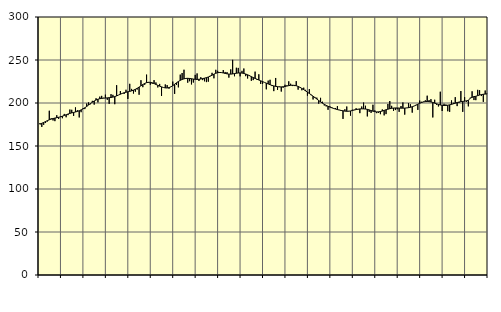
| Category | Piggar | Series 1 |
|---|---|---|
| nan | 176.6 | 175.3 |
| 1.0 | 172.2 | 176.43 |
| 1.0 | 174.6 | 177.39 |
| 1.0 | 176.7 | 178.47 |
| 1.0 | 178.5 | 179.49 |
| 1.0 | 191 | 180.46 |
| 1.0 | 182.2 | 181.28 |
| 1.0 | 179.7 | 181.91 |
| 1.0 | 178.9 | 182.47 |
| 1.0 | 185.8 | 182.92 |
| 1.0 | 181.4 | 183.39 |
| 1.0 | 184.4 | 183.97 |
| nan | 182.3 | 184.66 |
| 2.0 | 187.3 | 185.47 |
| 2.0 | 183.4 | 186.33 |
| 2.0 | 185.9 | 187.17 |
| 2.0 | 192.4 | 187.9 |
| 2.0 | 192.1 | 188.5 |
| 2.0 | 184.9 | 189.02 |
| 2.0 | 194.9 | 189.56 |
| 2.0 | 191.6 | 190.21 |
| 2.0 | 183.2 | 191.01 |
| 2.0 | 189.3 | 191.97 |
| 2.0 | 193.7 | 193.13 |
| nan | 192.9 | 194.47 |
| 3.0 | 199.4 | 195.99 |
| 3.0 | 200.7 | 197.65 |
| 3.0 | 198.5 | 199.34 |
| 3.0 | 202.5 | 200.93 |
| 3.0 | 198.1 | 202.33 |
| 3.0 | 205.5 | 203.49 |
| 3.0 | 200.7 | 204.38 |
| 3.0 | 207.4 | 204.97 |
| 3.0 | 208.3 | 205.35 |
| 3.0 | 206 | 205.61 |
| 3.0 | 209.7 | 205.77 |
| nan | 203.7 | 205.95 |
| 4.0 | 199 | 206.16 |
| 4.0 | 210.3 | 206.43 |
| 4.0 | 209.5 | 206.84 |
| 4.0 | 198.6 | 207.45 |
| 4.0 | 220.7 | 208.26 |
| 4.0 | 209.2 | 209.23 |
| 4.0 | 213.9 | 210.21 |
| 4.0 | 211.4 | 211.14 |
| 4.0 | 210.5 | 211.93 |
| 4.0 | 215.4 | 212.54 |
| 4.0 | 204.7 | 213.02 |
| nan | 222.3 | 213.51 |
| 5.0 | 216.4 | 214.12 |
| 5.0 | 211 | 214.92 |
| 5.0 | 213.1 | 215.91 |
| 5.0 | 215.7 | 217.13 |
| 5.0 | 209.6 | 218.53 |
| 5.0 | 226.5 | 220.03 |
| 5.0 | 218.4 | 221.5 |
| 5.0 | 221.1 | 222.75 |
| 5.0 | 233 | 223.64 |
| 5.0 | 223.5 | 224.08 |
| 5.0 | 221.3 | 224.03 |
| nan | 222.4 | 223.51 |
| 6.0 | 226.6 | 222.63 |
| 6.0 | 223.9 | 221.58 |
| 6.0 | 218.1 | 220.55 |
| 6.0 | 222.2 | 219.59 |
| 6.0 | 208.2 | 218.74 |
| 6.0 | 218.1 | 218.03 |
| 6.0 | 221.6 | 217.56 |
| 6.0 | 220.8 | 217.49 |
| 6.0 | 216.6 | 217.9 |
| 6.0 | 219 | 218.79 |
| 6.0 | 224.9 | 220.16 |
| nan | 210.6 | 221.8 |
| 7.0 | 221.1 | 223.47 |
| 7.0 | 218.2 | 225.01 |
| 7.0 | 233 | 226.32 |
| 7.0 | 234.9 | 227.37 |
| 7.0 | 238.7 | 228.12 |
| 7.0 | 228.4 | 228.57 |
| 7.0 | 223.6 | 228.69 |
| 7.0 | 225.3 | 228.54 |
| 7.0 | 221.6 | 228.21 |
| 7.0 | 223.8 | 227.85 |
| 7.0 | 232.7 | 227.56 |
| nan | 234.4 | 227.43 |
| 8.0 | 225.6 | 227.56 |
| 8.0 | 230 | 227.9 |
| 8.0 | 226.6 | 228.38 |
| 8.0 | 225.2 | 228.91 |
| 8.0 | 224.3 | 229.51 |
| 8.0 | 224.8 | 230.25 |
| 8.0 | 231.6 | 231.2 |
| 8.0 | 235.1 | 232.33 |
| 8.0 | 228.7 | 233.52 |
| 8.0 | 238.6 | 234.56 |
| 8.0 | 237.4 | 235.25 |
| nan | 235 | 235.5 |
| 9.0 | 235.6 | 235.36 |
| 9.0 | 238.3 | 234.94 |
| 9.0 | 236.1 | 234.39 |
| 9.0 | 235.9 | 233.91 |
| 9.0 | 229.5 | 233.61 |
| 9.0 | 239.1 | 233.58 |
| 9.0 | 250.2 | 233.82 |
| 9.0 | 231.1 | 234.2 |
| 9.0 | 241 | 234.61 |
| 9.0 | 240.8 | 234.9 |
| 9.0 | 231 | 234.97 |
| nan | 237.4 | 234.8 |
| 10.0 | 240.1 | 234.37 |
| 10.0 | 231.2 | 233.7 |
| 10.0 | 228.5 | 232.82 |
| 10.0 | 232.4 | 231.77 |
| 10.0 | 225.8 | 230.66 |
| 10.0 | 226.6 | 229.61 |
| 10.0 | 236.5 | 228.62 |
| 10.0 | 227 | 227.67 |
| 10.0 | 233.4 | 226.73 |
| 10.0 | 222.2 | 225.79 |
| 10.0 | 222.1 | 224.88 |
| nan | 224 | 223.97 |
| 11.0 | 215.9 | 223.05 |
| 11.0 | 226 | 222.13 |
| 11.0 | 227 | 221.26 |
| 11.0 | 219.7 | 220.49 |
| 11.0 | 213.8 | 219.85 |
| 11.0 | 229.1 | 219.34 |
| 11.0 | 215.2 | 218.96 |
| 11.0 | 219.2 | 218.74 |
| 11.0 | 213.3 | 218.72 |
| 11.0 | 217.8 | 218.89 |
| 11.0 | 221.2 | 219.24 |
| nan | 220.5 | 219.72 |
| 12.0 | 225.2 | 220.19 |
| 12.0 | 222.4 | 220.55 |
| 12.0 | 219.7 | 220.67 |
| 12.0 | 219.7 | 220.51 |
| 12.0 | 225.4 | 220.05 |
| 12.0 | 215.5 | 219.3 |
| 12.0 | 217.9 | 218.23 |
| 12.0 | 214.8 | 216.95 |
| 12.0 | 217.8 | 215.54 |
| 12.0 | 215.3 | 214.07 |
| 12.0 | 208.5 | 212.57 |
| nan | 216.2 | 211.06 |
| 13.0 | 209 | 209.51 |
| 13.0 | 204.1 | 207.91 |
| 13.0 | 207 | 206.27 |
| 13.0 | 206.2 | 204.6 |
| 13.0 | 199.2 | 202.91 |
| 13.0 | 206 | 201.26 |
| 13.0 | 201.5 | 199.79 |
| 13.0 | 197.1 | 198.48 |
| 13.0 | 196 | 197.29 |
| 13.0 | 192.1 | 196.21 |
| 13.0 | 196.1 | 195.25 |
| nan | 195.1 | 194.41 |
| 14.0 | 193.3 | 193.65 |
| 14.0 | 194.2 | 192.97 |
| 14.0 | 196.4 | 192.35 |
| 14.0 | 192 | 191.81 |
| 14.0 | 191.7 | 191.34 |
| 14.0 | 181.5 | 190.92 |
| 14.0 | 192.7 | 190.54 |
| 14.0 | 195.9 | 190.35 |
| 14.0 | 190.8 | 190.42 |
| 14.0 | 185.3 | 190.76 |
| 14.0 | 192.2 | 191.27 |
| nan | 192.2 | 191.82 |
| 15.0 | 193.9 | 192.36 |
| 15.0 | 192.3 | 192.8 |
| 15.0 | 188.2 | 193.1 |
| 15.0 | 195.9 | 193.21 |
| 15.0 | 200.5 | 193.16 |
| 15.0 | 196.8 | 192.98 |
| 15.0 | 184.4 | 192.61 |
| 15.0 | 189.7 | 192 |
| 15.0 | 188.5 | 191.22 |
| 15.0 | 198 | 190.48 |
| 15.0 | 191.4 | 189.92 |
| nan | 188.2 | 189.64 |
| 16.0 | 188.5 | 189.7 |
| 16.0 | 187 | 190.07 |
| 16.0 | 192.5 | 190.66 |
| 16.0 | 185.6 | 191.39 |
| 16.0 | 187.1 | 192.14 |
| 16.0 | 198.9 | 192.82 |
| 16.0 | 202.3 | 193.37 |
| 16.0 | 196.7 | 193.82 |
| 16.0 | 190.7 | 194.12 |
| 16.0 | 191.8 | 194.24 |
| 16.0 | 192.7 | 194.21 |
| nan | 189.7 | 194.11 |
| 17.0 | 196.5 | 194.02 |
| 17.0 | 200.6 | 193.98 |
| 17.0 | 186.5 | 194.05 |
| 17.0 | 194.4 | 194.24 |
| 17.0 | 199.8 | 194.58 |
| 17.0 | 198.6 | 195.03 |
| 17.0 | 188.8 | 195.66 |
| 17.0 | 196.5 | 196.48 |
| 17.0 | 197.8 | 197.48 |
| 17.0 | 192 | 198.61 |
| 17.0 | 202.8 | 199.68 |
| nan | 201.4 | 200.58 |
| 18.0 | 201.6 | 201.25 |
| 18.0 | 203.1 | 201.61 |
| 18.0 | 208.5 | 201.7 |
| 18.0 | 203.4 | 201.59 |
| 18.0 | 204.5 | 201.22 |
| 18.0 | 183.2 | 200.62 |
| 18.0 | 203.8 | 199.85 |
| 18.0 | 197.9 | 199.06 |
| 18.0 | 196 | 198.32 |
| 18.0 | 213.1 | 197.69 |
| 18.0 | 190.7 | 197.28 |
| nan | 199.1 | 197.1 |
| 19.0 | 198.3 | 197.14 |
| 19.0 | 190.4 | 197.43 |
| 19.0 | 189.7 | 197.88 |
| 19.0 | 203 | 198.42 |
| 19.0 | 200.2 | 199.06 |
| 19.0 | 206.8 | 199.79 |
| 19.0 | 196.4 | 200.53 |
| 19.0 | 200.2 | 201.12 |
| 19.0 | 213.9 | 201.54 |
| 19.0 | 189.7 | 201.88 |
| 19.0 | 206.8 | 202.16 |
| nan | 201.4 | 202.52 |
| 20.0 | 196.1 | 203.01 |
| 20.0 | 206.1 | 205.68 |
| 20.0 | 213.6 | 206.55 |
| 20.0 | 203.4 | 207.46 |
| 20.0 | 203.3 | 207.81 |
| 20.0 | 215.3 | 208.6 |
| 20.0 | 214.9 | 209.26 |
| 20.0 | 208.1 | 209.79 |
| 20.0 | 201.3 | 210.16 |
| 20.0 | 214.5 | 210.39 |
| 20.0 | 210.8 | 210.59 |